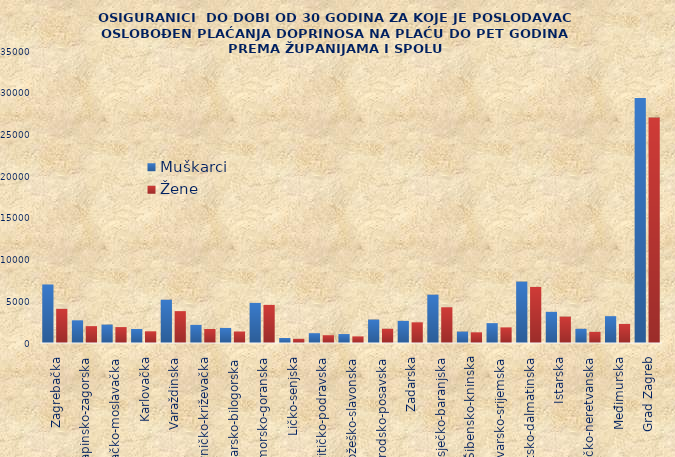
| Category | Muškarci | Žene |
|---|---|---|
| Zagrebačka | 7017 | 4097 |
| Krapinsko-zagorska | 2720 | 2021 |
| Sisačko-moslavačka | 2205 | 1908 |
| Karlovačka | 1683 | 1402 |
| Varaždinska | 5189 | 3820 |
| Koprivničko-križevačka | 2171 | 1679 |
| Bjelovarsko-bilogorska | 1804 | 1380 |
| Primorsko-goranska | 4806 | 4568 |
| Ličko-senjska | 603 | 503 |
| Virovitičko-podravska | 1176 | 932 |
| Požeško-slavonska | 1073 | 794 |
| Brodsko-posavska | 2812 | 1710 |
| Zadarska | 2654 | 2477 |
| Osječko-baranjska | 5796 | 4285 |
| Šibensko-kninska | 1369 | 1280 |
| Vukovarsko-srijemska | 2381 | 1874 |
| Splitsko-dalmatinska | 7361 | 6721 |
| Istarska | 3732 | 3165 |
| Dubrovačko-neretvanska | 1704 | 1335 |
| Međimurska | 3217 | 2285 |
| Grad Zagreb | 29359 | 27028 |